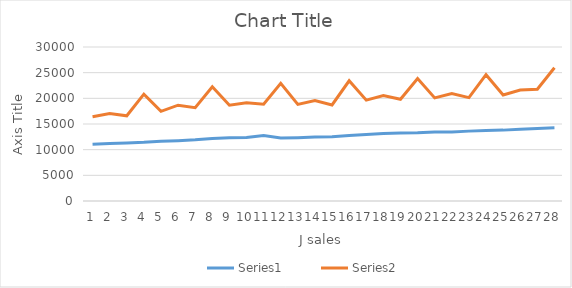
| Category | Series 0 | Series 1 |
|---|---|---|
| 0 | 11041 | 5372 |
| 1 | 11198 | 5841 |
| 2 | 11287 | 5311 |
| 3 | 11426 | 9385 |
| 4 | 11652 | 5823 |
| 5 | 11752 | 6911 |
| 6 | 11925 | 6243 |
| 7 | 12190 | 10073 |
| 8 | 12321 | 6337 |
| 9 | 12355 | 6772 |
| 10 | 12748 | 6102 |
| 11 | 12259 | 10651 |
| 12 | 12336 | 6484 |
| 13 | 12454 | 7106 |
| 14 | 12534 | 6175 |
| 15 | 12736 | 10686 |
| 16 | 12962 | 6681 |
| 17 | 13127 | 7397 |
| 18 | 13265 | 6548 |
| 19 | 13277 | 10586 |
| 20 | 13465 | 6617 |
| 21 | 13465 | 7477 |
| 22 | 13612 | 6529 |
| 23 | 13726 | 10882 |
| 24 | 13807 | 6851 |
| 25 | 13977 | 7648 |
| 26 | 14129 | 7635 |
| 27 | 14270 | 11684 |